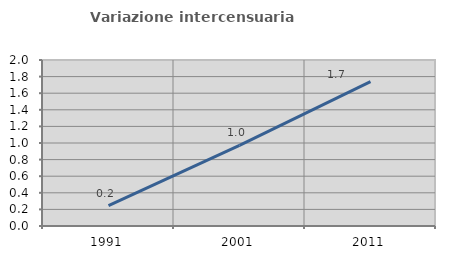
| Category | Variazione intercensuaria annua |
|---|---|
| 1991.0 | 0.245 |
| 2001.0 | 0.97 |
| 2011.0 | 1.74 |